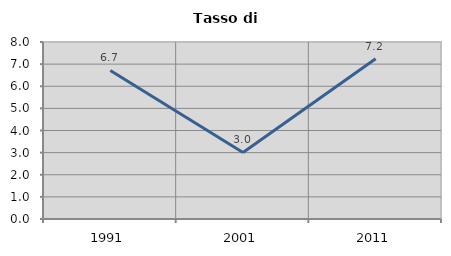
| Category | Tasso di disoccupazione   |
|---|---|
| 1991.0 | 6.713 |
| 2001.0 | 3.007 |
| 2011.0 | 7.239 |